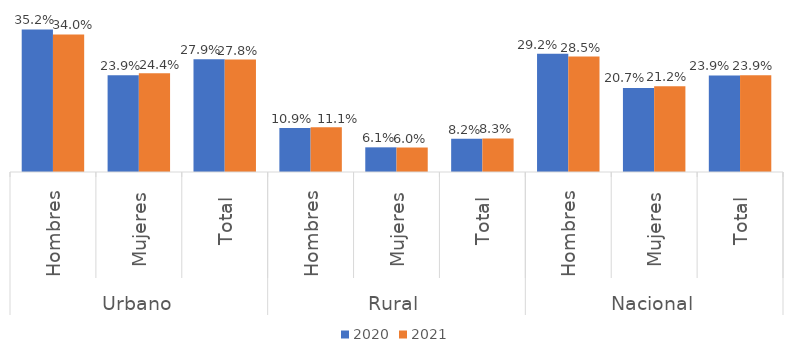
| Category | 2020 | 2021 |
|---|---|---|
| 0 | 0.352 | 0.34 |
| 1 | 0.239 | 0.244 |
| 2 | 0.279 | 0.278 |
| 3 | 0.109 | 0.111 |
| 4 | 0.061 | 0.06 |
| 5 | 0.082 | 0.083 |
| 6 | 0.292 | 0.285 |
| 7 | 0.207 | 0.212 |
| 8 | 0.239 | 0.239 |